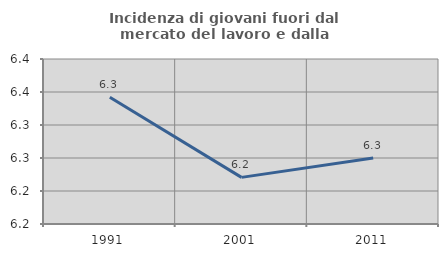
| Category | Incidenza di giovani fuori dal mercato del lavoro e dalla formazione  |
|---|---|
| 1991.0 | 6.342 |
| 2001.0 | 6.221 |
| 2011.0 | 6.25 |